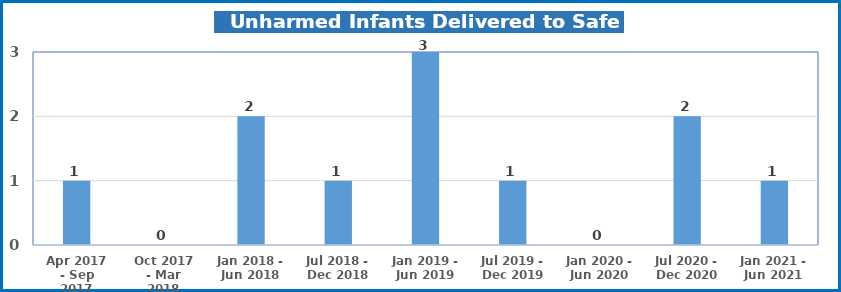
| Category | Series 0 |
|---|---|
| Apr 2017 - Sep 2017 | 1 |
| Oct 2017 - Mar 2018 | 0 |
| Jan 2018 - Jun 2018 | 2 |
| Jul 2018 - Dec 2018 | 1 |
| Jan 2019 - Jun 2019 | 3 |
| Jul 2019 - Dec 2019 | 1 |
| Jan 2020 - Jun 2020 | 0 |
| Jul 2020 - Dec 2020 | 2 |
| Jan 2021 - Jun 2021 | 1 |